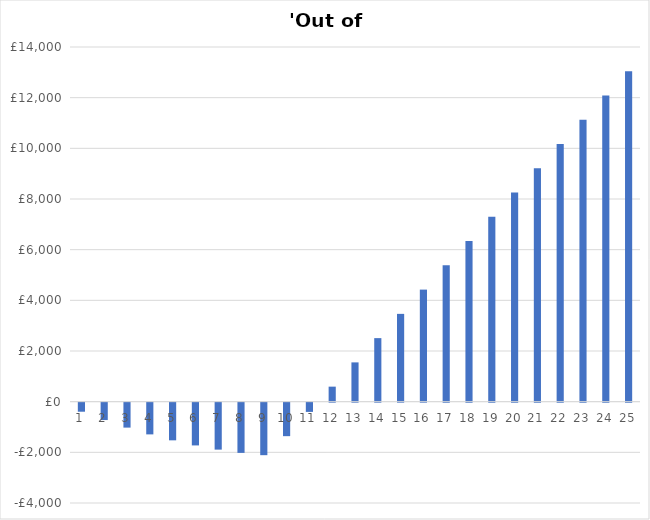
| Category | Series 0 |
|---|---|
| 1.0 | -357.4 |
| 2.0 | -686.03 |
| 3.0 | -984.682 |
| 4.0 | -1252.096 |
| 5.0 | -1486.961 |
| 6.0 | -1687.909 |
| 7.0 | -1853.516 |
| 8.0 | -1982.299 |
| 9.0 | -2072.709 |
| 10.0 | -1322.27 |
| 11.0 | -364.67 |
| 12.0 | 592.93 |
| 13.0 | 1550.53 |
| 14.0 | 2508.13 |
| 15.0 | 3465.73 |
| 16.0 | 4423.33 |
| 17.0 | 5380.93 |
| 18.0 | 6338.53 |
| 19.0 | 7296.13 |
| 20.0 | 8253.73 |
| 21.0 | 9211.33 |
| 22.0 | 10168.93 |
| 23.0 | 11126.53 |
| 24.0 | 12084.13 |
| 25.0 | 13041.73 |